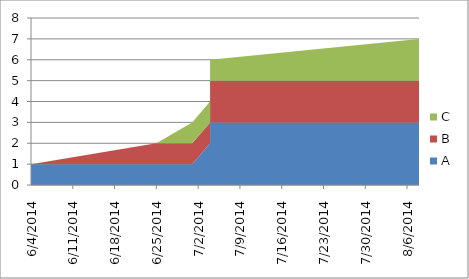
| Category | A | B | C |
|---|---|---|---|
| 6/4/14 | 1 | 0 | 0 |
| 6/25/14 | 1 | 1 | 0 |
| 7/1/14 | 1 | 1 | 1 |
| 7/4/14 | 2 | 1 | 1 |
| 7/4/14 | 3 | 1 | 1 |
| 7/4/14 | 3 | 2 | 1 |
| 8/8/14 | 3 | 2 | 2 |